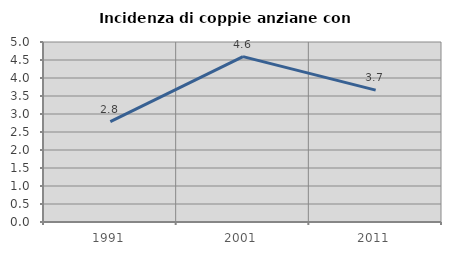
| Category | Incidenza di coppie anziane con figli |
|---|---|
| 1991.0 | 2.787 |
| 2001.0 | 4.593 |
| 2011.0 | 3.662 |